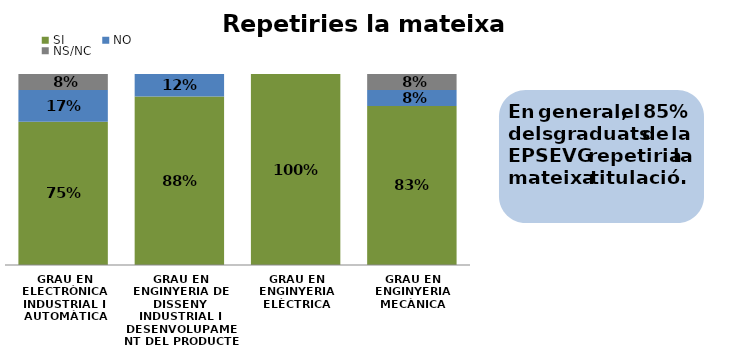
| Category | SI  | NO  | NS/NC |
|---|---|---|---|
| GRAU EN ELECTRÒNICA INDUSTRIAL I AUTOMÀTICA | 0.75 | 0.167 | 0.083 |
| GRAU EN ENGINYERIA DE DISSENY INDUSTRIAL I DESENVOLUPAMENT DEL PRODUCTE | 0.882 | 0.118 | 0 |
| GRAU EN ENGINYERIA ELÈCTRICA | 1 | 0 | 0 |
| GRAU EN ENGINYERIA MECÀNICA | 0.833 | 0.083 | 0.083 |